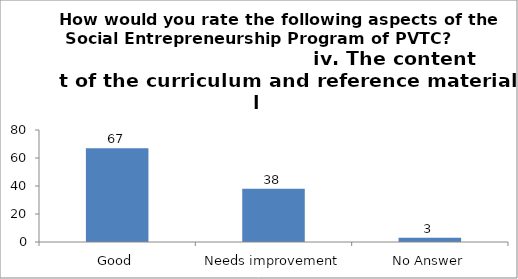
| Category | How would you rate the following aspects of the Social Entrepreneurship program of PVTC? iv. The content of the curriculum and reference material  |
|---|---|
| Good | 67 |
| Needs improvement | 38 |
| No Answer | 3 |